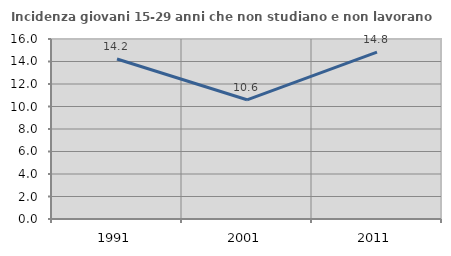
| Category | Incidenza giovani 15-29 anni che non studiano e non lavorano  |
|---|---|
| 1991.0 | 14.223 |
| 2001.0 | 10.596 |
| 2011.0 | 14.827 |